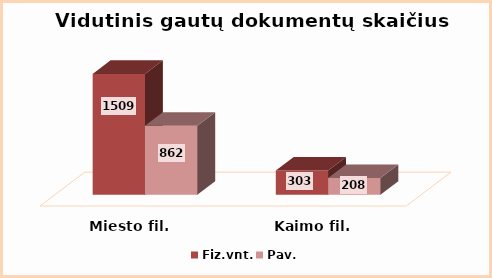
| Category | Fiz.vnt. | Pav. |
|---|---|---|
| Miesto fil. | 1509 | 862 |
| Kaimo fil. | 303 | 208 |